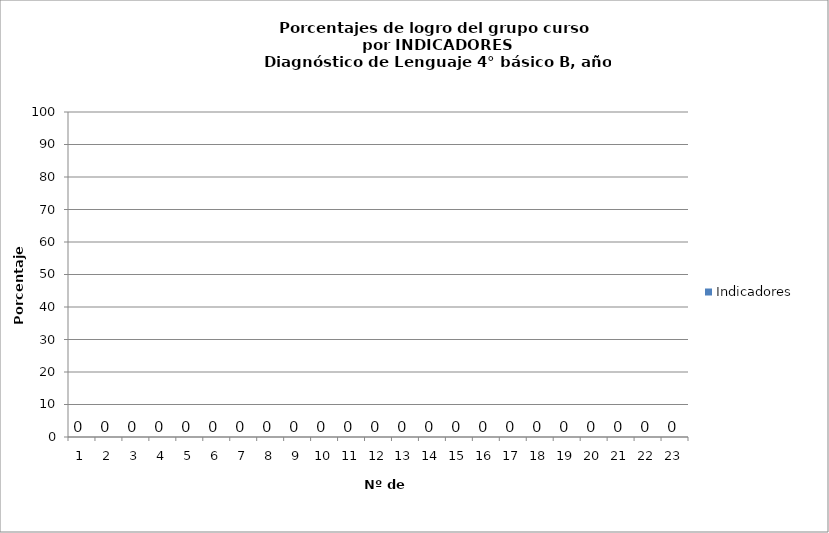
| Category | Indicadores |
|---|---|
| 0 | 0 |
| 1 | 0 |
| 2 | 0 |
| 3 | 0 |
| 4 | 0 |
| 5 | 0 |
| 6 | 0 |
| 7 | 0 |
| 8 | 0 |
| 9 | 0 |
| 10 | 0 |
| 11 | 0 |
| 12 | 0 |
| 13 | 0 |
| 14 | 0 |
| 15 | 0 |
| 16 | 0 |
| 17 | 0 |
| 18 | 0 |
| 19 | 0 |
| 20 | 0 |
| 21 | 0 |
| 22 | 0 |